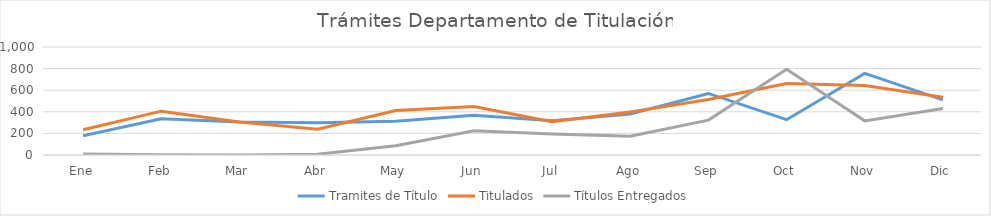
| Category | Tramites de Título | Titulados | Títulos Entregados |
|---|---|---|---|
| Ene | 178 | 234 | 10 |
| Feb | 335 | 406 | 3 |
| Mar | 306 | 306 | 0 |
| Abr | 299 | 238 | 7 |
| May | 312 | 411 | 86 |
| Jun | 368 | 448 | 225 |
| Jul | 318 | 309 | 194 |
| Ago | 379 | 399 | 174 |
| Sep | 570 | 514 | 323 |
| Oct | 327 | 661 | 793 |
| Nov | 756 | 643 | 316 |
| Dic | 511 | 535 | 430 |